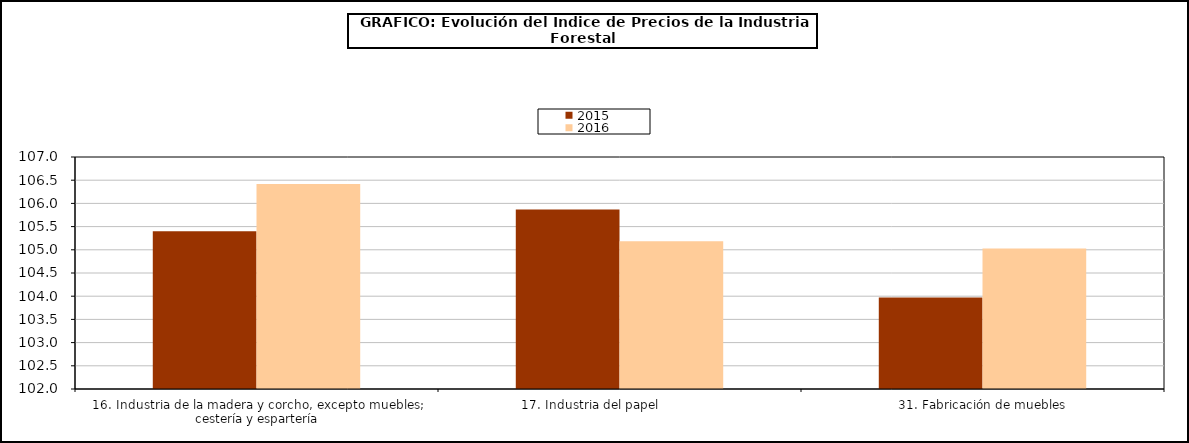
| Category | 2015 | 2016 |
|---|---|---|
| 16. Industria de la madera y corcho, excepto muebles; cestería y espartería | 105.4 | 106.42 |
| 17. Industria del papel                | 105.87 | 105.183 |
| 31. Fabricación de muebles | 103.972 | 105.027 |